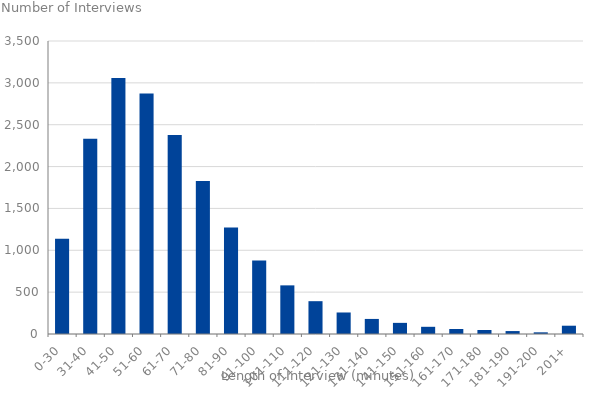
| Category | Series 0 |
|---|---|
| 0-30 | 1138 |
| 31-40 | 2332 |
| 41-50 | 3058 |
| 51-60 | 2874 |
| 61-70 | 2377 |
| 71-80 | 1828 |
| 81-90 | 1272 |
| 91-100 | 879 |
| 101-110 | 581 |
| 111-120 | 392 |
| 121-130 | 257 |
| 131-140 | 180 |
| 141-150 | 133 |
| 151-160 | 86 |
| 161-170 | 60 |
| 171-180 | 48 |
| 181-190 | 35 |
| 191-200 | 20 |
| 201+ | 99 |